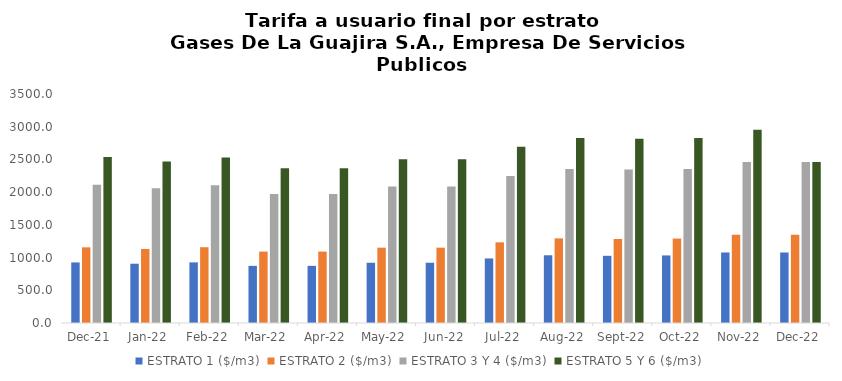
| Category | ESTRATO 1 ($/m3) | ESTRATO 2 ($/m3) | ESTRATO 3 Y 4 ($/m3) | ESTRATO 5 Y 6 ($/m3) |
|---|---|---|---|---|
| 2021-12-01 | 925.76 | 1156.56 | 2113.12 | 2535.744 |
| 2022-01-01 | 906.06 | 1131.99 | 2058.47 | 2470.164 |
| 2022-02-01 | 926.6 | 1158.16 | 2107.04 | 2528.448 |
| 2022-03-01 | 873.25 | 1091.56 | 1971.08 | 2365.296 |
| 2022-04-01 | 873.25 | 1091.56 | 1971.08 | 2365.296 |
| 2022-05-01 | 920.85 | 1151.33 | 2084.51 | 2501.412 |
| 2022-06-01 | 920.85 | 1151.33 | 2084.51 | 2501.412 |
| 2022-07-01 | 986.73 | 1232.87 | 2244.9 | 2693.88 |
| 2022-08-01 | 1035.13 | 1293.39 | 2355.1 | 2826.12 |
| 2022-09-01 | 1026.99 | 1283.72 | 2345.53 | 2814.6 |
| 2022-10-01 | 1032.88 | 1290.83 | 2355.1 | 2826.12 |
| 2022-11-01 | 1077.8 | 1346.96 | 2461.97 | 2954.364 |
| 2022-12-01 | 1077.8 | 1346.96 | 2461.97 | 2461.97 |